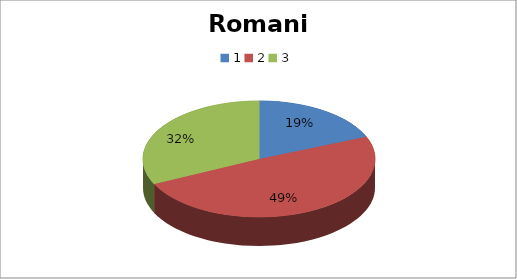
| Category | Romania |
|---|---|
| 0 | 21 |
| 1 | 55 |
| 2 | 36 |